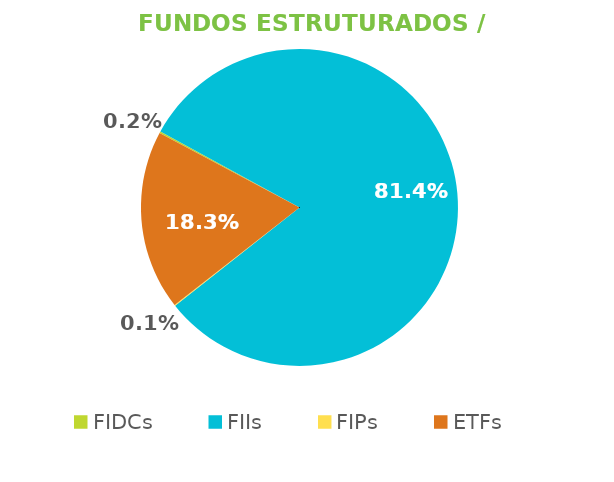
| Category | Fundos Estruturados / ETFs |
|---|---|
| FIDCs | 0.002 |
| FIIs | 0.814 |
| FIPs | 0.001 |
| ETFs | 0.183 |